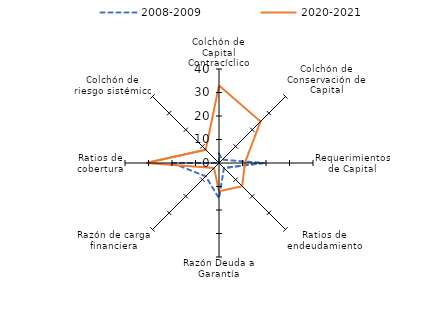
| Category | 2008-2009 | 2020-2021 |
|---|---|---|
| Colchón de Capital Contracíclico | 4 | 33 |
| Colchón de Conservación de Capital | 2 | 25 |
| Requerimientos de Capital | 19 | 11 |
| Ratios de endeudamiento | 3 | 14 |
| Razón Deuda a Garantía | 15 | 12 |
| Razón de carga financiera | 8 | 3 |
| Ratios de cobertura | 20 | 31 |
| Colchón de riesgo sistémico | 0 | 8 |